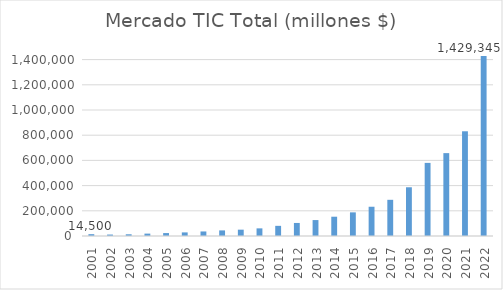
| Category | Mercado TIC Total (millones $) |
|---|---|
| 2001.0 | 14500 |
| 2002.0 | 11520 |
| 2003.0 | 13645 |
| 2004.0 | 18960 |
| 2005.0 | 23290 |
| 2006.0 | 28600 |
| 2007.0 | 36055 |
| 2008.0 | 44450 |
| 2009.0 | 50200 |
| 2010.0 | 60626 |
| 2011.0 | 80586 |
| 2012.0 | 103505 |
| 2013.0 | 126469 |
| 2014.0 | 153048 |
| 2015.0 | 187620 |
| 2016.0 | 232210 |
| 2017.0 | 287188 |
| 2018.0 | 386736 |
| 2019.0 | 580242 |
| 2020.0 | 657736 |
| 2021.0 | 831066 |
| 2022.0 | 1429345 |